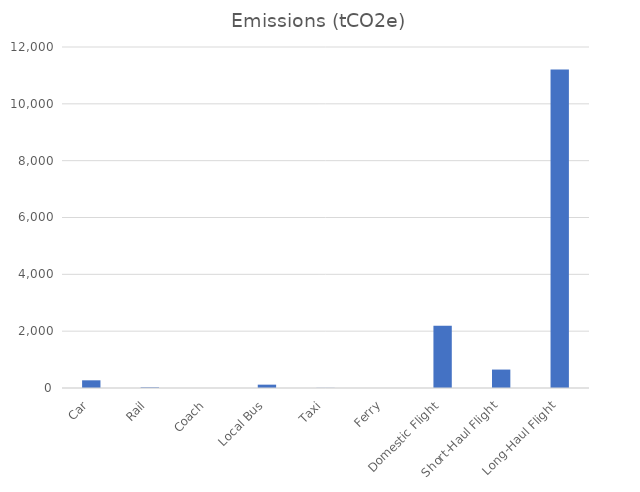
| Category | Emissions (tCO2e) |
|---|---|
| Car | 270.627 |
| Rail | 23.684 |
| Coach | 0 |
| Local Bus | 117.511 |
| Taxi | 5.021 |
| Ferry | 0 |
| Domestic Flight | 2194.448 |
| Short-Haul Flight | 648.483 |
| Long-Haul Flight | 11204.91 |